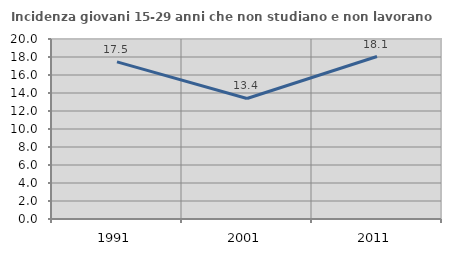
| Category | Incidenza giovani 15-29 anni che non studiano e non lavorano  |
|---|---|
| 1991.0 | 17.456 |
| 2001.0 | 13.393 |
| 2011.0 | 18.056 |